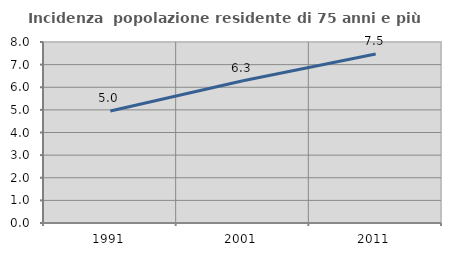
| Category | Incidenza  popolazione residente di 75 anni e più |
|---|---|
| 1991.0 | 4.951 |
| 2001.0 | 6.291 |
| 2011.0 | 7.469 |